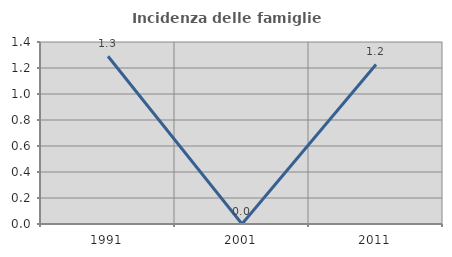
| Category | Incidenza delle famiglie numerose |
|---|---|
| 1991.0 | 1.29 |
| 2001.0 | 0 |
| 2011.0 | 1.227 |